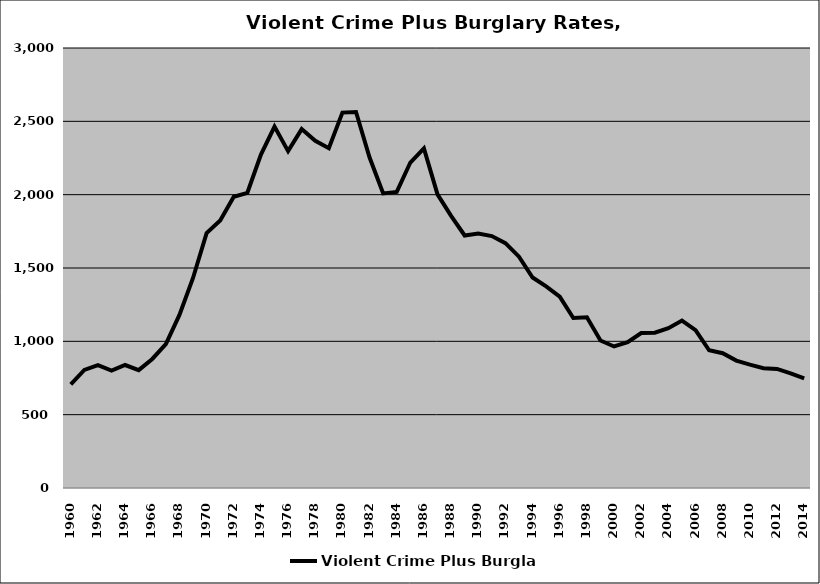
| Category | Violent Crime Plus Burglary |
|---|---|
| 1960.0 | 707.205 |
| 1961.0 | 805.166 |
| 1962.0 | 837.861 |
| 1963.0 | 800.816 |
| 1964.0 | 838.555 |
| 1965.0 | 803.657 |
| 1966.0 | 879.97 |
| 1967.0 | 981.215 |
| 1968.0 | 1180.029 |
| 1969.0 | 1432.048 |
| 1970.0 | 1737.676 |
| 1971.0 | 1823.653 |
| 1972.0 | 1985.448 |
| 1973.0 | 2012.762 |
| 1974.0 | 2272.957 |
| 1975.0 | 2464.286 |
| 1976.0 | 2296.864 |
| 1977.0 | 2447.155 |
| 1978.0 | 2367.528 |
| 1979.0 | 2316.486 |
| 1980.0 | 2559.402 |
| 1981.0 | 2563.348 |
| 1982.0 | 2253.333 |
| 1983.0 | 2008.793 |
| 1984.0 | 2019.1 |
| 1985.0 | 2219.096 |
| 1986.0 | 2315.152 |
| 1987.0 | 2002.093 |
| 1988.0 | 1855.653 |
| 1989.0 | 1721.767 |
| 1990.0 | 1734.765 |
| 1991.0 | 1717.619 |
| 1992.0 | 1669.712 |
| 1993.0 | 1577.117 |
| 1994.0 | 1435.312 |
| 1995.0 | 1374.299 |
| 1996.0 | 1305.231 |
| 1997.0 | 1159.337 |
| 1998.0 | 1164.417 |
| 1999.0 | 1005.638 |
| 2000.0 | 964.833 |
| 2001.0 | 993.571 |
| 2002.0 | 1056.642 |
| 2003.0 | 1058.815 |
| 2004.0 | 1089.373 |
| 2005.0 | 1141.768 |
| 2006.0 | 1076.813 |
| 2007.0 | 939.111 |
| 2008.0 | 918.927 |
| 2009.0 | 868.879 |
| 2010.0 | 840.81 |
| 2011.0 | 817.192 |
| 2012.0 | 811.53 |
| 2013.0 | 780.981 |
| 2014.0 | 747.33 |